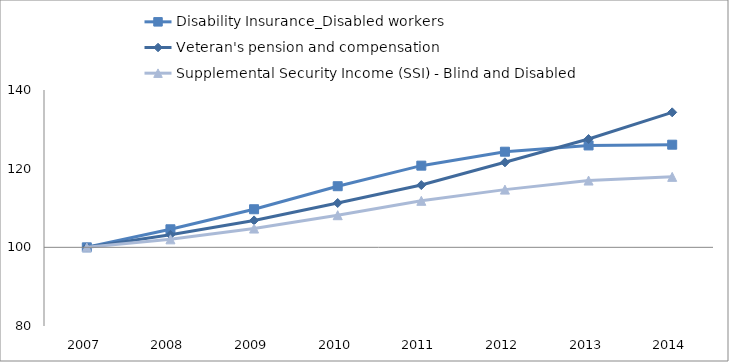
| Category | Disability Insurance_Disabled workers | Veteran's pension and compensation | Supplemental Security Income (SSI) - Blind and Disabled | 0 |
|---|---|---|---|---|
| 2007.0 | 100 | 100 | 100 |  |
| 2008.0 | 104.589 | 103.189 | 102.03 |  |
| 2009.0 | 109.685 | 106.847 | 104.776 |  |
| 2010.0 | 115.538 | 111.265 | 108.166 |  |
| 2011.0 | 120.767 | 115.83 | 111.83 |  |
| 2012.0 | 124.311 | 121.614 | 114.674 |  |
| 2013.0 | 125.905 | 127.532 | 116.977 |  |
| 2014.0 | 126.096 | 134.32 | 117.915 |  |